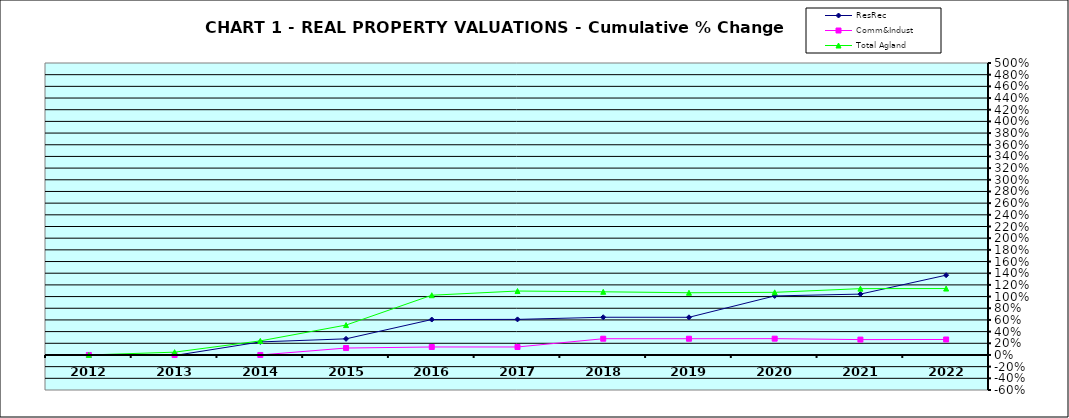
| Category | ResRec | Comm&Indust | Total Agland |
|---|---|---|---|
| 2012.0 | 0 | 0 | 0 |
| 2013.0 | -0.01 | 0 | 0.048 |
| 2014.0 | 0.224 | 0 | 0.241 |
| 2015.0 | 0.276 | 0.119 | 0.512 |
| 2016.0 | 0.607 | 0.137 | 1.023 |
| 2017.0 | 0.609 | 0.137 | 1.095 |
| 2018.0 | 0.646 | 0.278 | 1.082 |
| 2019.0 | 0.645 | 0.278 | 1.066 |
| 2020.0 | 1.011 | 0.279 | 1.073 |
| 2021.0 | 1.042 | 0.263 | 1.136 |
| 2022.0 | 1.366 | 0.265 | 1.137 |